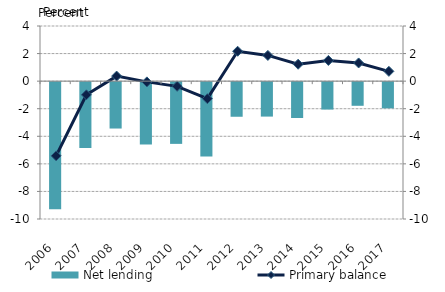
| Category | Net lending |
|---|---|
| 2006.0 | -9.221 |
| 2007.0 | -4.781 |
| 2008.0 | -3.365 |
| 2009.0 | -4.523 |
| 2010.0 | -4.478 |
| 2011.0 | -5.386 |
| 2012.0 | -2.511 |
| 2013.0 | -2.499 |
| 2014.0 | -2.602 |
| 2015.0 | -1.989 |
| 2016.0 | -1.716 |
| 2017.0 | -1.902 |